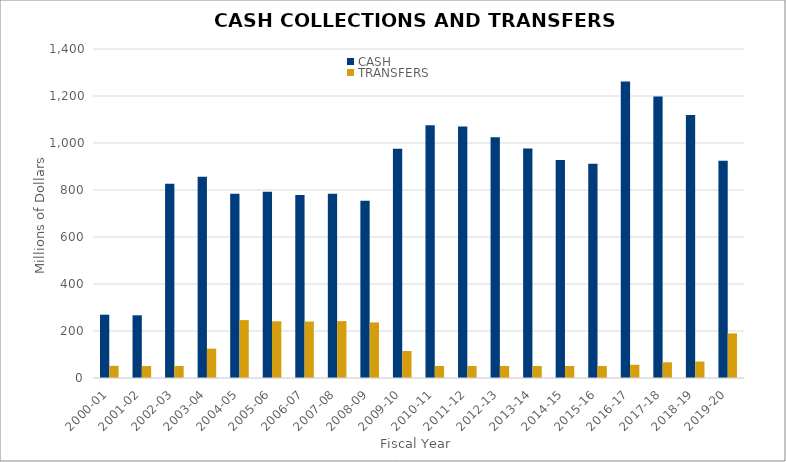
| Category | CASH | TRANSFERS |
|---|---|---|
| 2000-01 | 269.339 | 51.75 |
| 2001-02 | 266.795 | 51.21 |
| 2002-03 | 826.742 | 51.215 |
| 2003-04 | 856.442 | 124.955 |
| 2004-05 | 784.371 | 246.364 |
| 2005-06 | 792.124 | 241.446 |
| 2006-07 | 778.582 | 240.212 |
| 2007-08 | 784.055 | 242.039 |
| 2008-09 | 754.159 | 236.414 |
| 2009-10 | 976.056 | 114.881 |
| 2010-11 | 1075.366 | 51.215 |
| 2011-12 | 1069.907 | 51.215 |
| 2012-13 | 1024.081 | 51.215 |
| 2013-14 | 976.908 | 51.215 |
| 2014-15 | 927.205 | 51.215 |
| 2015-16 | 911.512 | 51.215 |
| 2016-17 | 1261.572 | 56.215 |
| 2017-18 | 1198.252 | 66.815 |
| 2018-19 | 1118.764 | 70.115 |
| 2019-20 | 924.341 | 189.72 |